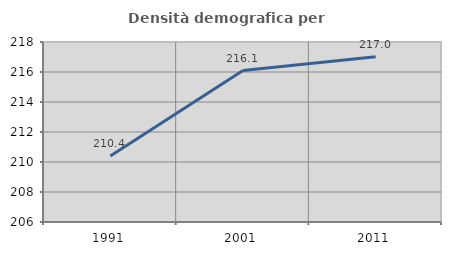
| Category | Densità demografica |
|---|---|
| 1991.0 | 210.396 |
| 2001.0 | 216.098 |
| 2011.0 | 217.009 |